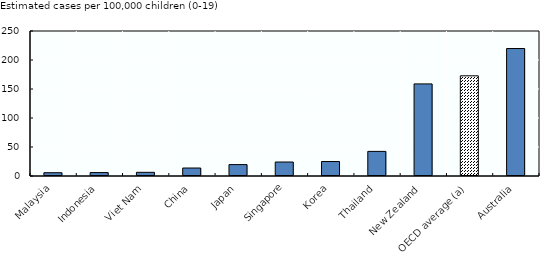
| Category | Series 1 |
|---|---|
| Malaysia | 5.663 |
| Indonesia | 5.916 |
| Viet Nam | 6.333 |
| China | 13.744 |
| Japan | 19.643 |
| Singapore | 24.1 |
| Korea | 24.968 |
| Thailand | 42.457 |
| New Zealand | 158.808 |
| OECD average (a) | 172.7 |
| Australia | 219.785 |